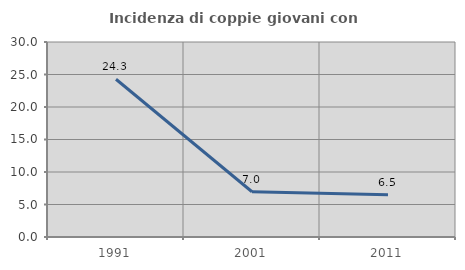
| Category | Incidenza di coppie giovani con figli |
|---|---|
| 1991.0 | 24.265 |
| 2001.0 | 6.962 |
| 2011.0 | 6.509 |